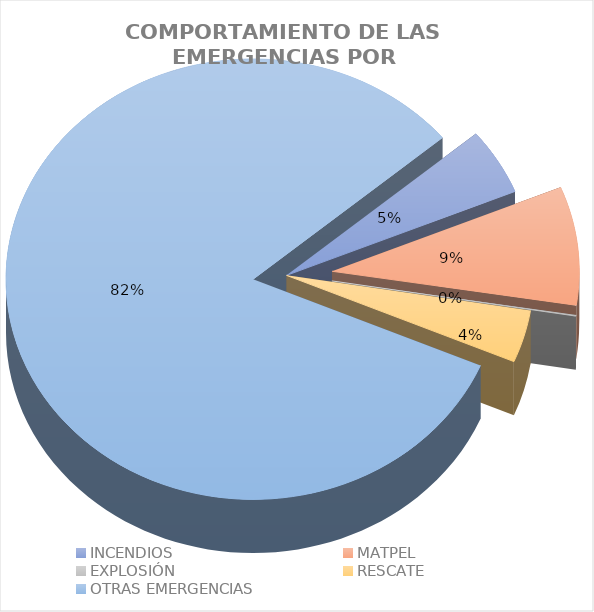
| Category | Series 0 |
|---|---|
| INCENDIOS | 0.049 |
| MATPEL | 0.087 |
| EXPLOSIÓN | 0.001 |
| RESCATE | 0.039 |
| OTRAS EMERGENCIAS | 0.825 |